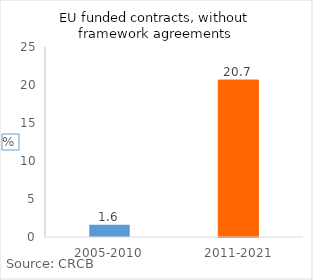
| Category | mgts_plus, without framework agreements, % |
|---|---|
| 2005-2010 | 1.611 |
| 2011-2021 | 20.652 |